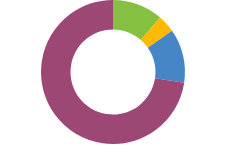
| Category | AKTĪVI |
|---|---|
| NAUDA | 43300 |
| INVESTĪCIJAS | 15000 |
| PENSIJA | 46000 |
| PERSONISKS | 276500 |